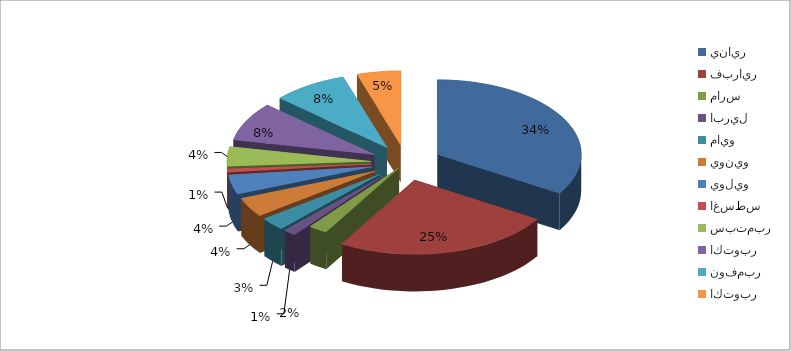
| Category | Series 0 |
|---|---|
| يناير | 48 |
| فبراير | 35 |
| مارس | 3 |
| ابريل | 2 |
| مايو | 4 |
| يونيو | 6 |
| يوليو | 6 |
| اغسطس | 1 |
| سبتمبر | 6 |
| اكتوبر | 12 |
| نوفمبر | 12 |
| اكتوبر | 7 |